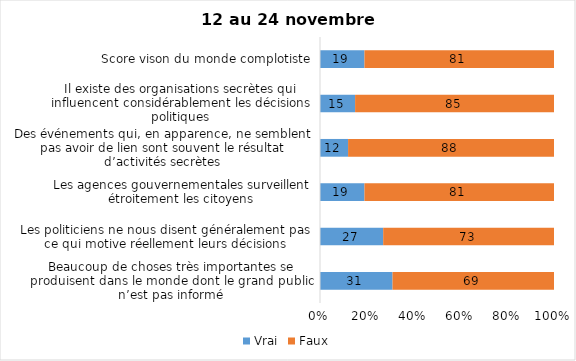
| Category | Vrai | Faux |
|---|---|---|
| Beaucoup de choses très importantes se produisent dans le monde dont le grand public n’est pas informé | 31 | 69 |
| Les politiciens ne nous disent généralement pas ce qui motive réellement leurs décisions | 27 | 73 |
| Les agences gouvernementales surveillent étroitement les citoyens | 19 | 81 |
| Des événements qui, en apparence, ne semblent pas avoir de lien sont souvent le résultat d’activités secrètes | 12 | 88 |
| Il existe des organisations secrètes qui influencent considérablement les décisions politiques | 15 | 85 |
| Score vison du monde complotiste | 19 | 81 |